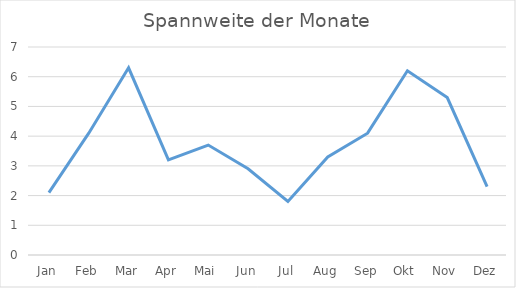
| Category | Series 0 |
|---|---|
| Jan | 2.1 |
| Feb | 4.1 |
| Mar | 6.3 |
| Apr | 3.2 |
| Mai | 3.7 |
| Jun | 2.9 |
| Jul | 1.8 |
| Aug | 3.3 |
| Sep | 4.1 |
| Okt | 6.2 |
| Nov | 5.3 |
| Dez | 2.3 |